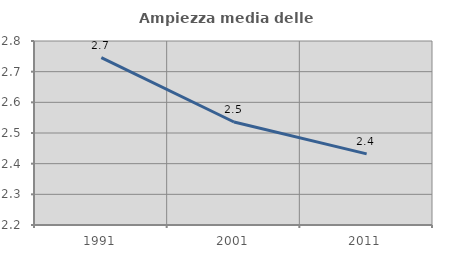
| Category | Ampiezza media delle famiglie |
|---|---|
| 1991.0 | 2.746 |
| 2001.0 | 2.536 |
| 2011.0 | 2.432 |